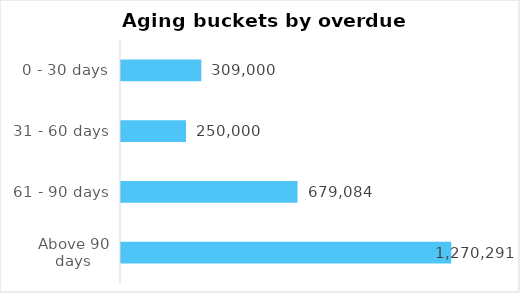
| Category | Total |
|---|---|
| Above 90 days | 1270291 |
| 61 - 90 days | 679084 |
| 31 - 60 days | 250000 |
| 0 - 30 days | 309000 |